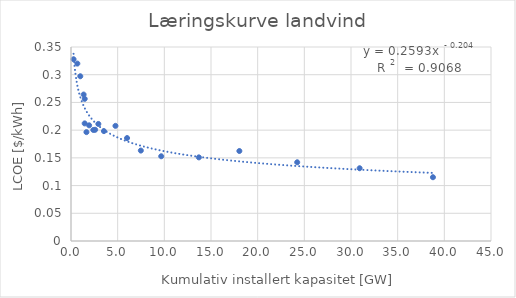
| Category | LCOE landvind [$/kWh] |
|---|---|
| 0.274 | 0.328 |
| 0.68 | 0.32 |
| 0.995 | 0.297 |
| 1.354 | 0.264 |
| 1.469 | 0.256 |
| 1.465 | 0.212 |
| 1.655 | 0.196 |
| 1.943 | 0.209 |
| 2.392 | 0.2 |
| 2.587 | 0.201 |
| 2.93 | 0.211 |
| 3.527 | 0.198 |
| 4.763 | 0.208 |
| 6.007 | 0.186 |
| 7.482 | 0.163 |
| 9.667 | 0.153 |
| 13.7 | 0.151 |
| 18.039 | 0.162 |
| 24.236 | 0.142 |
| 30.925 | 0.131 |
| 38.78 | 0.115 |